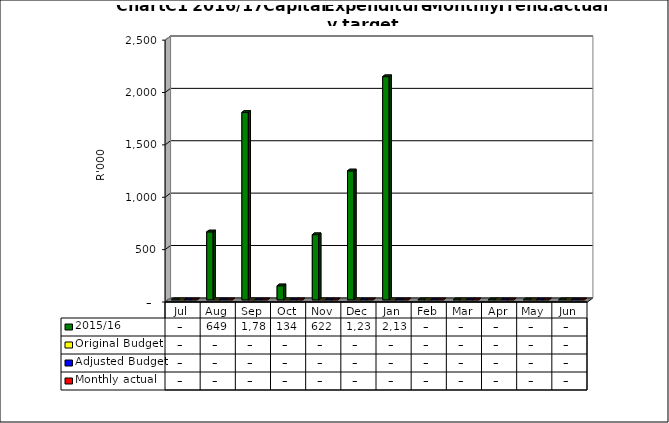
| Category | 2015/16 | Original Budget | Adjusted Budget | Monthly actual |
|---|---|---|---|---|
| Jul | 0 | 0 | 0 | 0 |
| Aug | 648829 | 0 | 0 | 0 |
| Sep | 1789463.99 | 0 | 0 | 0 |
| Oct | 134207.35 | 0 | 0 | 0 |
| Nov | 622404 | 0 | 0 | 0 |
| Dec | 1231184.28 | 0 | 0 | 0 |
| Jan | 2130879 | 0 | 0 | 0 |
| Feb | 0 | 0 | 0 | 0 |
| Mar | 0 | 0 | 0 | 0 |
| Apr | 0 | 0 | 0 | 0 |
| May | 0 | 0 | 0 | 0 |
| Jun | 0 | 0 | 0 | 0 |